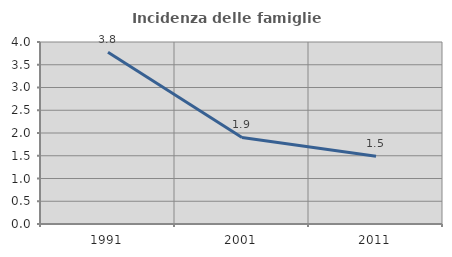
| Category | Incidenza delle famiglie numerose |
|---|---|
| 1991.0 | 3.774 |
| 2001.0 | 1.903 |
| 2011.0 | 1.49 |